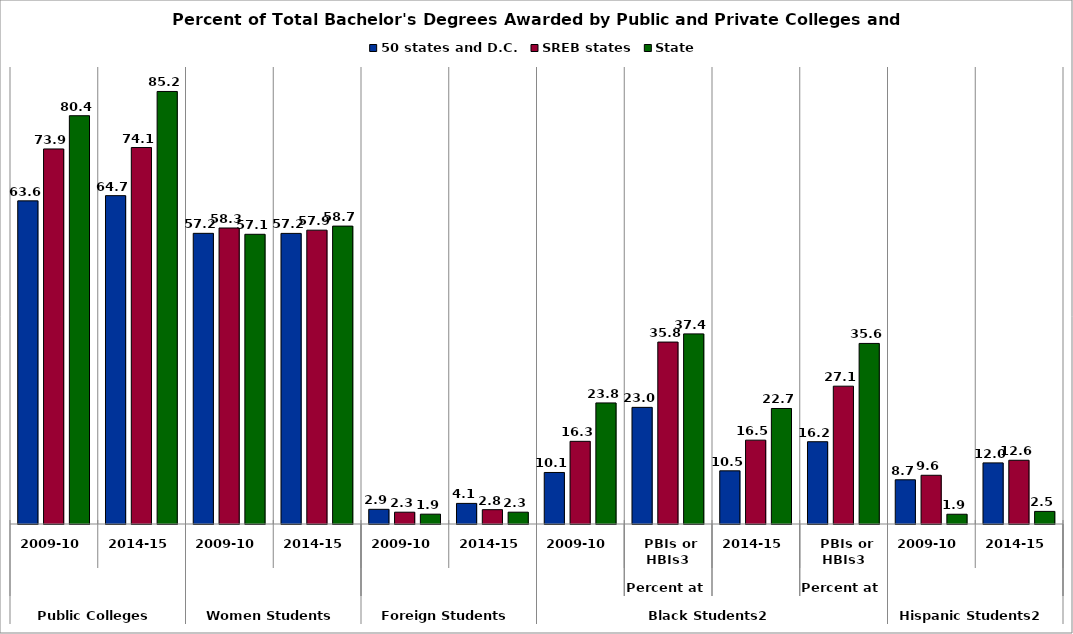
| Category | 50 states and D.C. | SREB states | State |
|---|---|---|---|
| 0 | 63.636 | 73.858 | 80.403 |
| 1 | 64.665 | 74.138 | 85.184 |
| 2 | 57.243 | 58.292 | 57.053 |
| 3 | 57.231 | 57.868 | 58.667 |
| 4 | 2.89 | 2.325 | 1.937 |
| 5 | 4.056 | 2.821 | 2.327 |
| 6 | 10.146 | 16.283 | 23.844 |
| 7 | 22.97 | 35.829 | 37.442 |
| 8 | 10.47 | 16.513 | 22.749 |
| 9 | 16.203 | 27.142 | 35.56 |
| 10 | 8.707 | 9.596 | 1.921 |
| 11 | 12.037 | 12.553 | 2.483 |